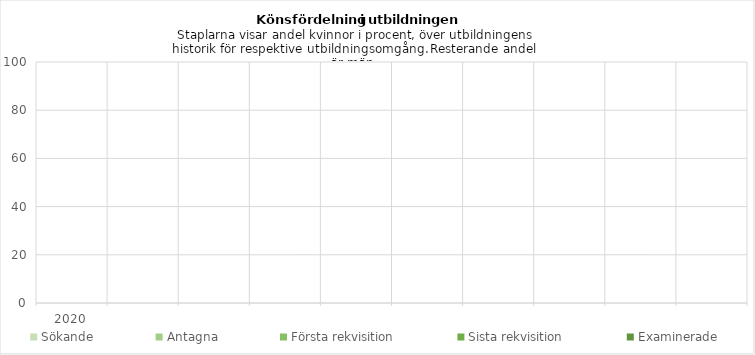
| Category | Sökande | Antagna | Första rekvisition | Sista rekvisition | Examinerade |
|---|---|---|---|---|---|
| 2020.0 | 0 | 0 | 0 | 0 | 0 |
| 0.0 | 0 | 0 | 0 | 0 | 0 |
| 0.0 | 0 | 0 | 0 | 0 | 0 |
| 0.0 | 0 | 0 | 0 | 0 | 0 |
| 0.0 | 0 | 0 | 0 | 0 | 0 |
| 0.0 | 0 | 0 | 0 | 0 | 0 |
| 0.0 | 0 | 0 | 0 | 0 | 0 |
| 0.0 | 0 | 0 | 0 | 0 | 0 |
| 0.0 | 0 | 0 | 0 | 0 | 0 |
| 0.0 | 0 | 0 | 0 | 0 | 0 |